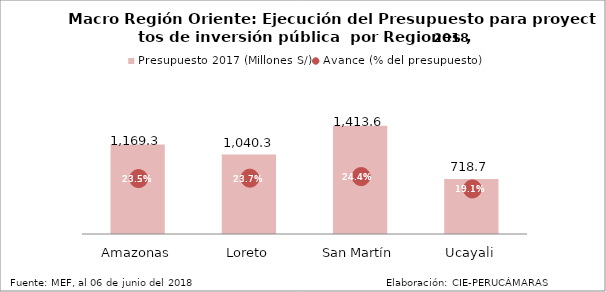
| Category | Presupuesto 2017 (Millones S/) |
|---|---|
| Amazonas | 1169.273 |
| Loreto | 1040.306 |
| San Martín | 1413.597 |
| Ucayali | 718.709 |